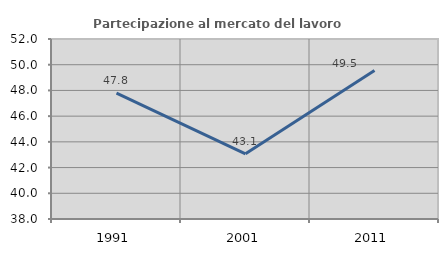
| Category | Partecipazione al mercato del lavoro  femminile |
|---|---|
| 1991.0 | 47.786 |
| 2001.0 | 43.067 |
| 2011.0 | 49.548 |